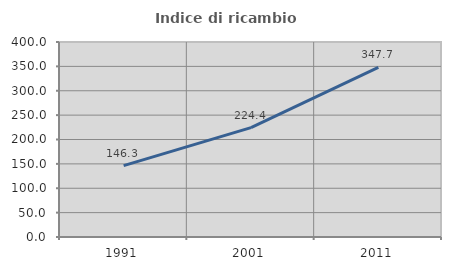
| Category | Indice di ricambio occupazionale  |
|---|---|
| 1991.0 | 146.296 |
| 2001.0 | 224.405 |
| 2011.0 | 347.742 |